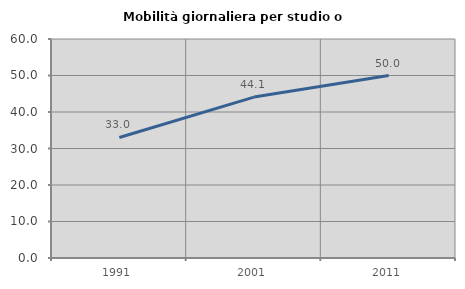
| Category | Mobilità giornaliera per studio o lavoro |
|---|---|
| 1991.0 | 33.028 |
| 2001.0 | 44.086 |
| 2011.0 | 50 |